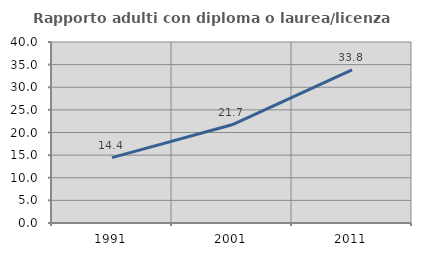
| Category | Rapporto adulti con diploma o laurea/licenza media  |
|---|---|
| 1991.0 | 14.444 |
| 2001.0 | 21.705 |
| 2011.0 | 33.824 |